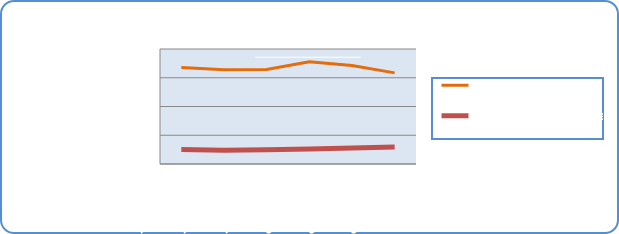
| Category | Motorin Türleri | Benzin Türleri |
|---|---|---|
| 7/29/19 | 67174597.708 | 10168567.209 |
| 7/30/19 | 65521494.284 | 9604680.672 |
| 7/31/19 | 65816255.645 | 9940812.616 |
| 8/1/19 | 71108126.304 | 10371373.707 |
| 8/2/19 | 68548683.289 | 11158326.238 |
| 8/3/19 | 63383672.342 | 11761709.906 |